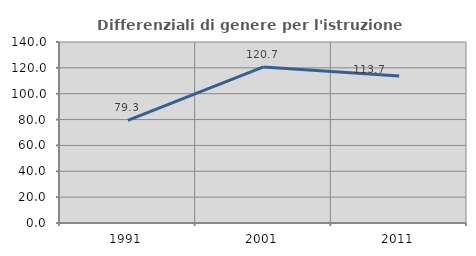
| Category | Differenziali di genere per l'istruzione superiore |
|---|---|
| 1991.0 | 79.345 |
| 2001.0 | 120.724 |
| 2011.0 | 113.665 |